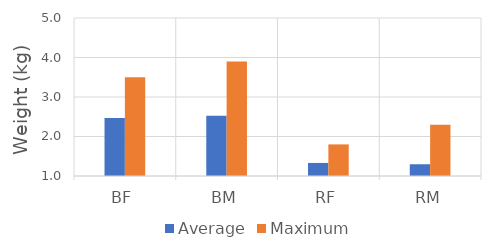
| Category | Average | Maximum |
|---|---|---|
| BF | 2.471 | 3.5 |
| BM | 2.526 | 3.9 |
| RF | 1.331 | 1.8 |
| RM | 1.297 | 2.3 |